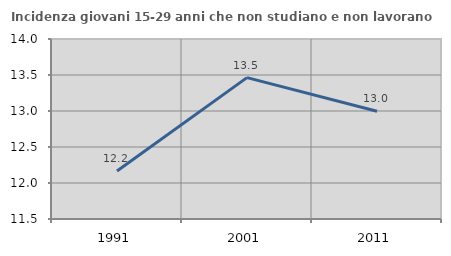
| Category | Incidenza giovani 15-29 anni che non studiano e non lavorano  |
|---|---|
| 1991.0 | 12.166 |
| 2001.0 | 13.464 |
| 2011.0 | 12.996 |